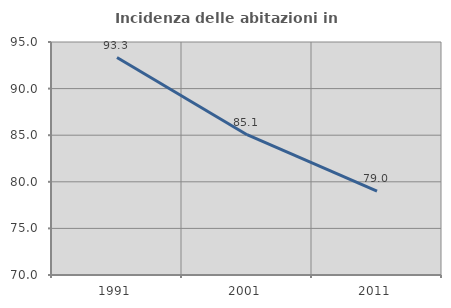
| Category | Incidenza delle abitazioni in proprietà  |
|---|---|
| 1991.0 | 93.333 |
| 2001.0 | 85.052 |
| 2011.0 | 79.012 |